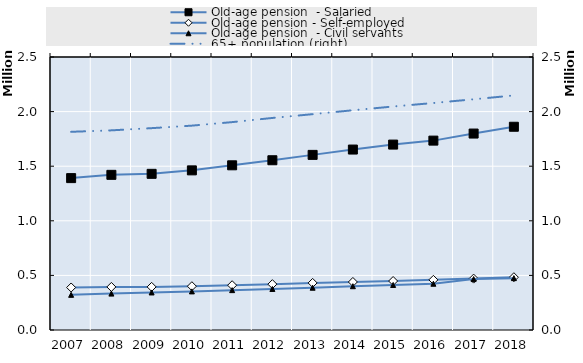
| Category | Old-age pension  - Salaried  | Old-age pension - Self-employed | 0 | Series 14 | Series 15 | Series 16 | Series 17 | Series 18 | Series 19 |
|---|---|---|---|---|---|---|---|---|---|
| 2007.0 | 1390867 | 389311 |  |  |  |  |  |  |  |
| 2008.0 | 1420893 | 394362 |  |  |  |  |  |  |  |
| 2009.0 | 1430082 | 394847 |  |  |  |  |  |  |  |
| 2010.0 | 1461865 | 400811 |  |  |  |  |  |  |  |
| 2011.0 | 1508186 | 410074 |  |  |  |  |  |  |  |
| 2012.0 | 1554521 | 419672 |  |  |  |  |  |  |  |
| 2013.0 | 1603629 | 431209 |  |  |  |  |  |  |  |
| 2014.0 | 1652481 | 439846 |  |  |  |  |  |  |  |
| 2015.0 | 1697932 | 448466 |  |  |  |  |  |  |  |
| 2016.0 | 1734258 | 459044 |  |  |  |  |  |  |  |
| 2017.0 | 1798879 | 470634 |  |  |  |  |  |  |  |
| 2018.0 | 1861239 | 483365 |  |  |  |  |  |  |  |